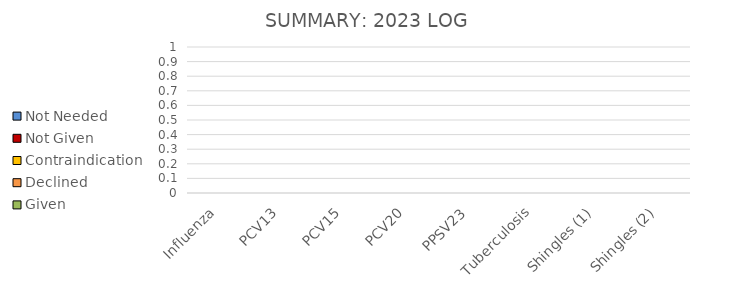
| Category | Given | Declined | Contraindication | Not Given | Not Needed |
|---|---|---|---|---|---|
| Influenza | 0 | 0 | 0 | 0 | 0 |
| PCV13 | 0 | 0 | 0 | 0 | 0 |
| PCV15 | 0 | 0 | 0 | 0 | 0 |
| PCV20 | 0 | 0 | 0 | 0 | 0 |
| PPSV23 | 0 | 0 | 0 | 0 | 0 |
| Tuberculosis | 0 | 0 | 0 | 0 | 0 |
| Shingles (1) | 0 | 0 | 0 | 0 | 0 |
| Shingles (2) | 0 | 0 | 0 | 0 | 0 |